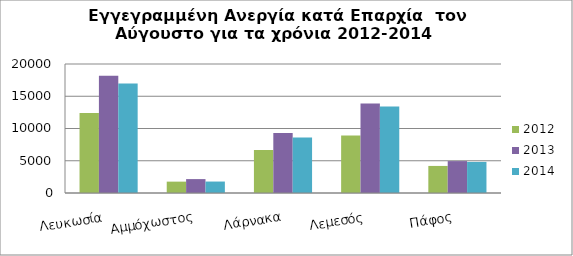
| Category | 2012 | 2013 | 2014 |
|---|---|---|---|
| Λευκωσία | 12390 | 18171 | 16958 |
| Αμμόχωστος | 1763 | 2156 | 1776 |
| Λάρνακα | 6658 | 9289 | 8612 |
| Λεμεσός | 8927 | 13891 | 13417 |
| Πάφος | 4196 | 4944 | 4820 |